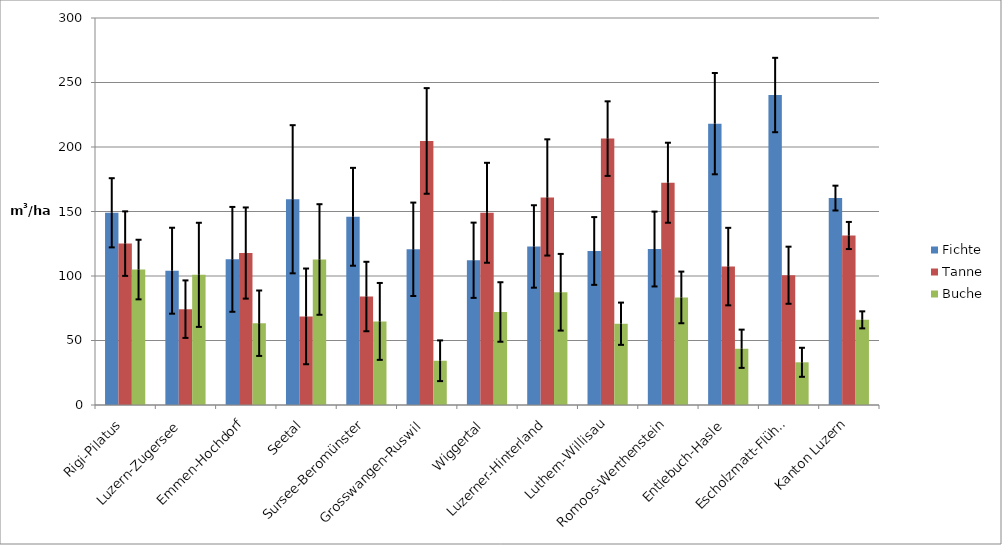
| Category | Fichte | Tanne | Buche |
|---|---|---|---|
| Rigi-Pilatus | 149 | 125.1 | 105 |
| Luzern-Zugersee | 104.1 | 74.3 | 100.9 |
| Emmen-Hochdorf | 112.9 | 117.8 | 63.4 |
| Seetal | 159.5 | 68.7 | 112.8 |
| Sursee-Beromünster | 145.9 | 84.1 | 64.8 |
| Grosswangen-Ruswil | 120.7 | 204.7 | 34.3 |
| Wiggertal | 112.2 | 149 | 72.1 |
| Luzerner-Hinterland | 122.9 | 160.9 | 87.4 |
| Luthern-Willisau | 119.4 | 206.5 | 63 |
| Romoos-Werthenstein | 120.9 | 172.3 | 83.4 |
| Entlebuch-Hasle | 218.1 | 107.3 | 43.6 |
| Escholzmatt-Flühli | 240.3 | 100.6 | 33.1 |
| Kanton Luzern | 160.4 | 131.4 | 66 |